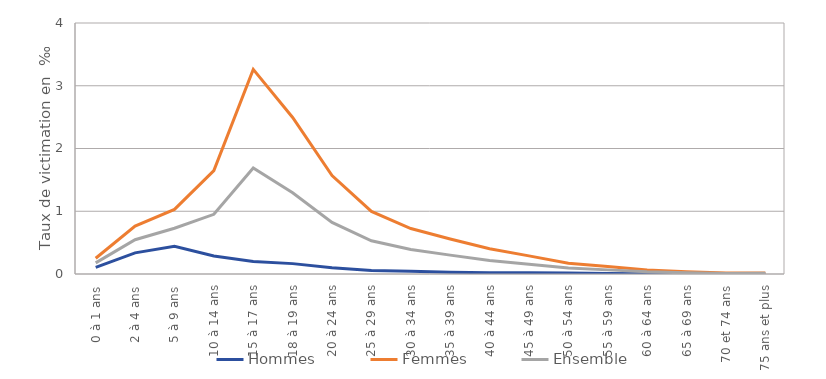
| Category | Hommes | Femmes | Ensemble |
|---|---|---|---|
| 0 à 1 ans | 0.105 | 0.252 | 0.177 |
| 2 à 4 ans | 0.336 | 0.765 | 0.546 |
| 5 à 9 ans | 0.441 | 1.029 | 0.729 |
| 10 à 14 ans | 0.287 | 1.647 | 0.951 |
| 15 à 17 ans | 0.201 | 3.261 | 1.689 |
| 18 à 19 ans | 0.165 | 2.494 | 1.296 |
| 20 à 24 ans | 0.101 | 1.568 | 0.822 |
| 25 à 29 ans | 0.055 | 0.997 | 0.53 |
| 30 à 34 ans | 0.043 | 0.724 | 0.392 |
| 35 à 39 ans | 0.03 | 0.559 | 0.301 |
| 40 à 44 ans | 0.019 | 0.402 | 0.214 |
| 45 à 49 ans | 0.018 | 0.289 | 0.155 |
| 50 à 54 ans | 0.016 | 0.171 | 0.094 |
| 55 à 59 ans | 0.01 | 0.119 | 0.066 |
| 60 à 64 ans | 0.004 | 0.063 | 0.034 |
| 65 à 69 ans | 0.002 | 0.034 | 0.019 |
| 70 et 74 ans | 0.001 | 0.015 | 0.009 |
| 75 ans et plus | 0.003 | 0.017 | 0.012 |